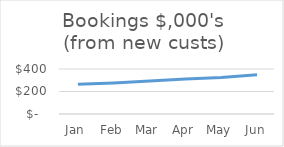
| Category | Bookings $,000's (new custs) |
|---|---|
| Jan | 264 |
| Feb | 276 |
| Mar | 294 |
| Apr | 312 |
| May | 324 |
| Jun | 348 |